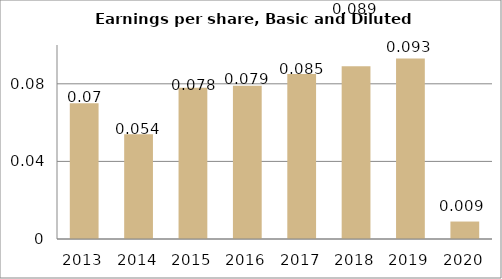
| Category | Series 1 |
|---|---|
| 2013.0 | 0.07 |
| 2014.0 | 0.054 |
| 2015.0 | 0.078 |
| 2016.0 | 0.079 |
| 2017.0 | 0.085 |
| 2018.0 | 0.089 |
| 2019.0 | 0.093 |
| 2020.0 | 0.009 |